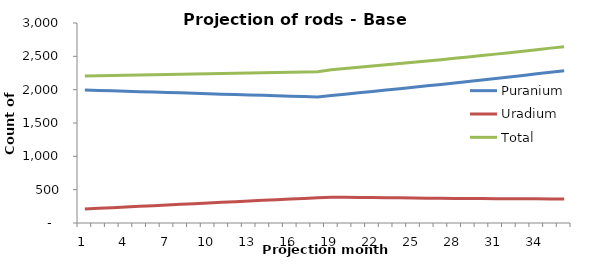
| Category | Puranium | Uradium | Total |
|---|---|---|---|
| 0 | 1994 | 210 | 2204 |
| 1 | 1988 | 220 | 2208 |
| 2 | 1982 | 230 | 2212 |
| 3 | 1976 | 240 | 2216 |
| 4 | 1970 | 250 | 2220 |
| 5 | 1964 | 260 | 2224 |
| 6 | 1958 | 270 | 2228 |
| 7 | 1952 | 280 | 2232 |
| 8 | 1946 | 290 | 2236 |
| 9 | 1940 | 300 | 2240 |
| 10 | 1933 | 310 | 2243 |
| 11 | 1927 | 320 | 2247 |
| 12 | 1921 | 330 | 2251 |
| 13 | 1915 | 340 | 2255 |
| 14 | 1909 | 350 | 2259 |
| 15 | 1903 | 360 | 2263 |
| 16 | 1897 | 369 | 2266 |
| 17 | 1891 | 378 | 2269 |
| 18 | 1911 | 387 | 2298 |
| 19 | 1932 | 385 | 2317 |
| 20 | 1953 | 383 | 2336 |
| 21 | 1974 | 381 | 2355 |
| 22 | 1994 | 379 | 2373 |
| 23 | 2015 | 377 | 2392 |
| 24 | 2036 | 375 | 2411 |
| 25 | 2057 | 373 | 2430 |
| 26 | 2079 | 371 | 2450 |
| 27 | 2101 | 369 | 2470 |
| 28 | 2123 | 367 | 2490 |
| 29 | 2145 | 366 | 2511 |
| 30 | 2168 | 365 | 2533 |
| 31 | 2191 | 364 | 2555 |
| 32 | 2214 | 363 | 2577 |
| 33 | 2238 | 362 | 2600 |
| 34 | 2262 | 361 | 2623 |
| 35 | 2285 | 360 | 2645 |